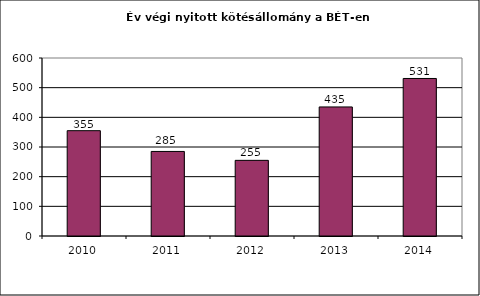
| Category | BÉT kontraktus (ezer db) |
|---|---|
| 2010.0 | 355 |
| 2011.0 | 285 |
| 2012.0 | 255 |
| 2013.0 | 435 |
| 2014.0 | 531 |